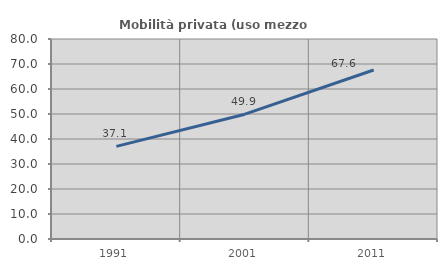
| Category | Mobilità privata (uso mezzo privato) |
|---|---|
| 1991.0 | 37.063 |
| 2001.0 | 49.921 |
| 2011.0 | 67.586 |